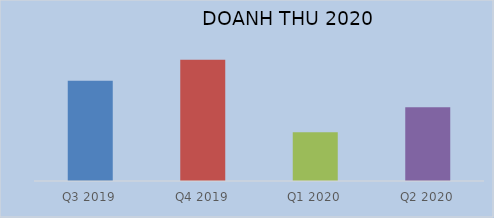
| Category | Series 0 |
|---|---|
| Q3 2019 | 31570918174253 |
| Q4 2019 | 38175708000000 |
| Q1 2020 | 15368486000000 |
| Q2 2020 | 23207431000000 |